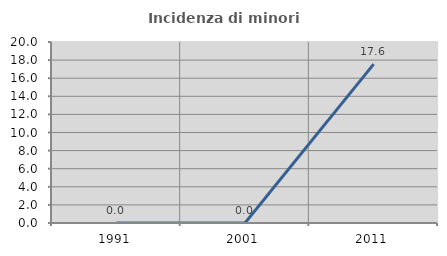
| Category | Incidenza di minori stranieri |
|---|---|
| 1991.0 | 0 |
| 2001.0 | 0 |
| 2011.0 | 17.557 |